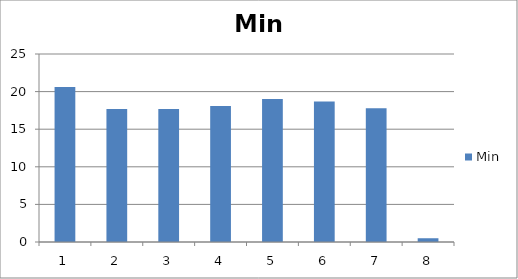
| Category | Min |
|---|---|
| 0 | 20.6 |
| 1 | 17.7 |
| 2 | 17.7 |
| 3 | 18.1 |
| 4 | 19 |
| 5 | 18.7 |
| 6 | 17.8 |
| 7 | 0.5 |